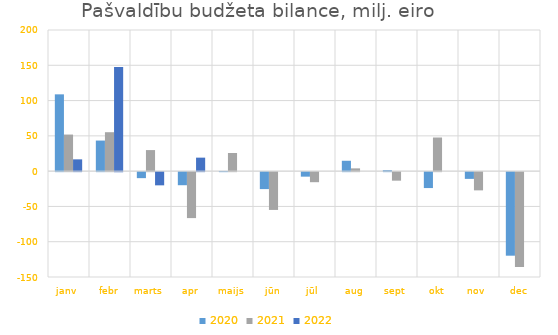
| Category | 2020 | 2021 | 2022 |
|---|---|---|---|
| janv | 108823.125 | 51841.777 | 16703.923 |
| febr | 43336.074 | 55170.117 | 147501.748 |
| marts | -8510.199 | 29854.421 | -18692.108 |
| apr | -18528 | -65110.731 | 19123.02 |
| maijs | 267.19 | 25695.562 | 0 |
| jūn | -24020.19 | -53546.319 | 0 |
| jūl | -6388.533 | -14251.375 | 0 |
| aug | 14711.699 | 3925.548 | 0 |
| sept | 1399.66 | -12077.429 | 0 |
| okt | -22549.866 | 47662.114 | 0 |
| nov | -9553.519 | -25816.685 | 0 |
| dec | -118383.812 | -134394.788 | 0 |